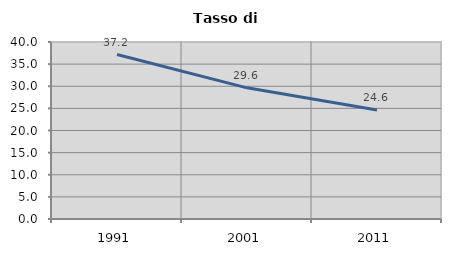
| Category | Tasso di disoccupazione   |
|---|---|
| 1991.0 | 37.167 |
| 2001.0 | 29.641 |
| 2011.0 | 24.633 |